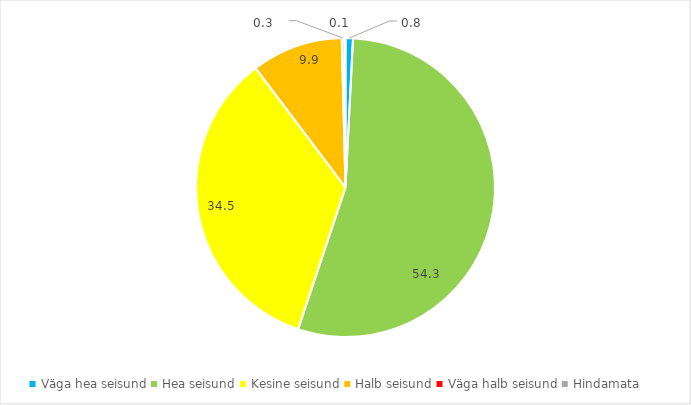
| Category | Series 0 |
|---|---|
| Väga hea seisund | 0.8 |
| Hea seisund | 54.267 |
| Kesine seisund | 34.533 |
| Halb seisund | 9.867 |
| Väga halb seisund | 0.267 |
| Hindamata | 0.133 |